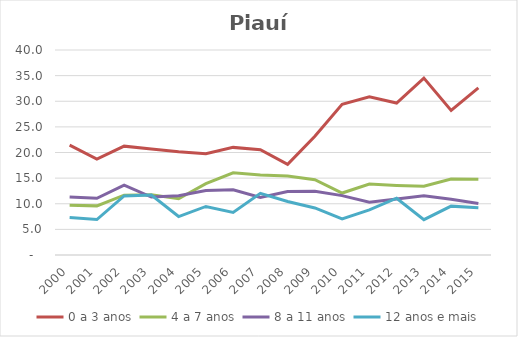
| Category | 0 a 3 anos | 4 a 7 anos | 8 a 11 anos | 12 anos e mais |
|---|---|---|---|---|
| 2000.0 | 21.451 | 9.708 | 11.335 | 7.296 |
| 2001.0 | 18.699 | 9.586 | 11.055 | 6.922 |
| 2002.0 | 21.239 | 11.67 | 13.61 | 11.519 |
| 2003.0 | 20.665 | 11.741 | 11.315 | 11.702 |
| 2004.0 | 20.141 | 10.979 | 11.581 | 7.504 |
| 2005.0 | 19.768 | 13.922 | 12.576 | 9.472 |
| 2006.0 | 20.998 | 16.045 | 12.736 | 8.313 |
| 2007.0 | 20.532 | 15.595 | 11.245 | 12.029 |
| 2008.0 | 17.682 | 15.418 | 12.388 | 10.443 |
| 2009.0 | 23.163 | 14.699 | 12.442 | 9.174 |
| 2010.0 | 29.417 | 12.09 | 11.584 | 7.047 |
| 2011.0 | 30.871 | 13.846 | 10.282 | 8.81 |
| 2012.0 | 29.65 | 13.57 | 10.945 | 11.082 |
| 2013.0 | 34.528 | 13.403 | 11.536 | 6.886 |
| 2014.0 | 28.223 | 14.824 | 10.892 | 9.536 |
| 2015.0 | 32.597 | 14.76 | 10.04 | 9.216 |